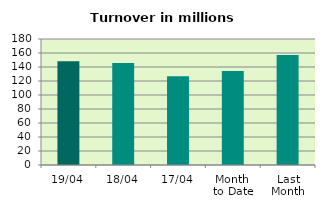
| Category | Series 0 |
|---|---|
| 19/04 | 148.179 |
| 18/04 | 145.862 |
| 17/04 | 126.739 |
| Month 
to Date | 134.302 |
| Last
Month | 157.238 |